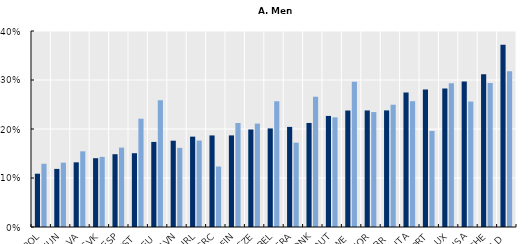
| Category | Mid-1990s | Mid-2010s |
|---|---|---|
| POL | 0.109 | 0.129 |
| HUN | 0.119 | 0.131 |
| LVA | 0.132 | 0.154 |
| SVK | 0.14 | 0.143 |
| ESP | 0.149 | 0.162 |
| EST | 0.151 | 0.221 |
| DEU | 0.174 | 0.259 |
| SVN | 0.176 | 0.162 |
| IRL | 0.184 | 0.176 |
| GRC | 0.187 | 0.123 |
| FIN | 0.187 | 0.212 |
| CZE | 0.199 | 0.211 |
| BEL | 0.201 | 0.257 |
| FRA | 0.204 | 0.172 |
| DNK | 0.212 | 0.266 |
| AUT | 0.227 | 0.224 |
| SWE | 0.238 | 0.297 |
| NOR | 0.238 | 0.235 |
| GBR | 0.238 | 0.25 |
| ITA | 0.274 | 0.257 |
| PRT | 0.281 | 0.196 |
| LUX | 0.283 | 0.293 |
| USA | 0.297 | 0.256 |
| CHE | 0.312 | 0.294 |
| NLD | 0.372 | 0.318 |